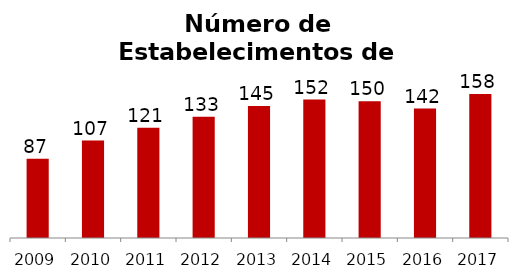
| Category | Alimentação |
|---|---|
| 2009.0 | 87 |
| 2010.0 | 107 |
| 2011.0 | 121 |
| 2012.0 | 133 |
| 2013.0 | 145 |
| 2014.0 | 152 |
| 2015.0 | 150 |
| 2016.0 | 142 |
| 2017.0 | 158 |